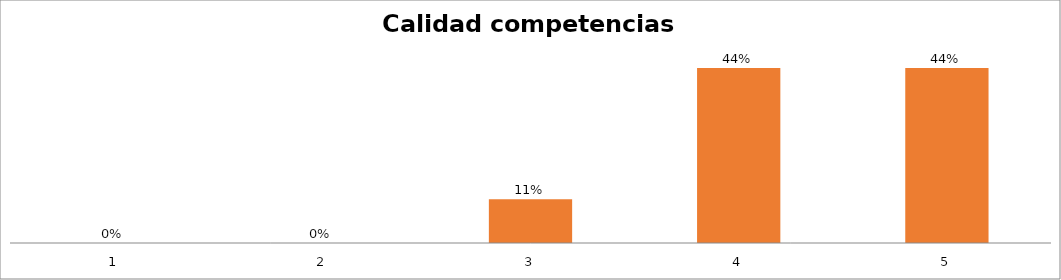
| Category | Series 1 |
|---|---|
| 0 | 0 |
| 1 | 0 |
| 2 | 0.111 |
| 3 | 0.444 |
| 4 | 0.444 |